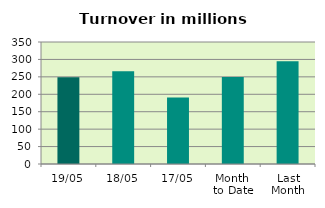
| Category | Series 0 |
|---|---|
| 19/05 | 249.109 |
| 18/05 | 265.971 |
| 17/05 | 190.478 |
| Month 
to Date | 249.259 |
| Last
Month | 294.539 |